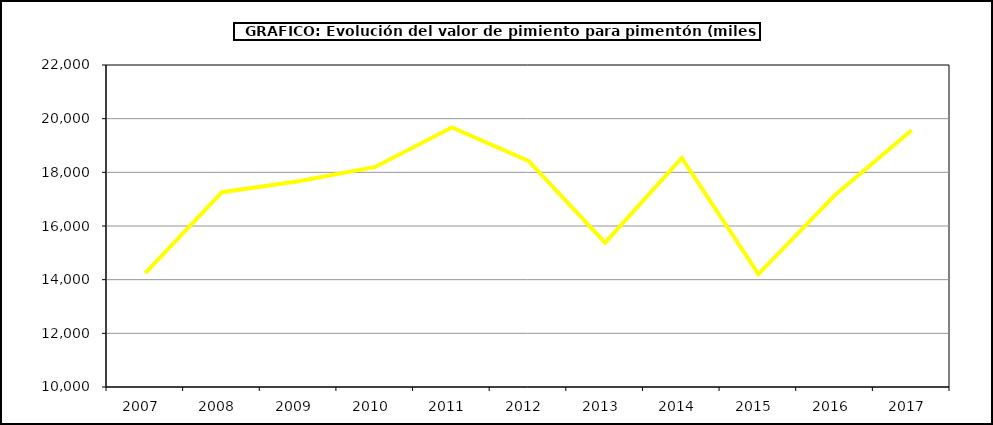
| Category | Valor |
|---|---|
| 2007.0 | 14247.039 |
| 2008.0 | 17258.828 |
| 2009.0 | 17665.33 |
| 2010.0 | 18201.072 |
| 2011.0 | 19672.3 |
| 2012.0 | 18426.65 |
| 2013.0 | 15378.158 |
| 2014.0 | 18538.464 |
| 2015.0 | 14208 |
| 2016.0 | 17155 |
| 2017.0 | 19566.151 |